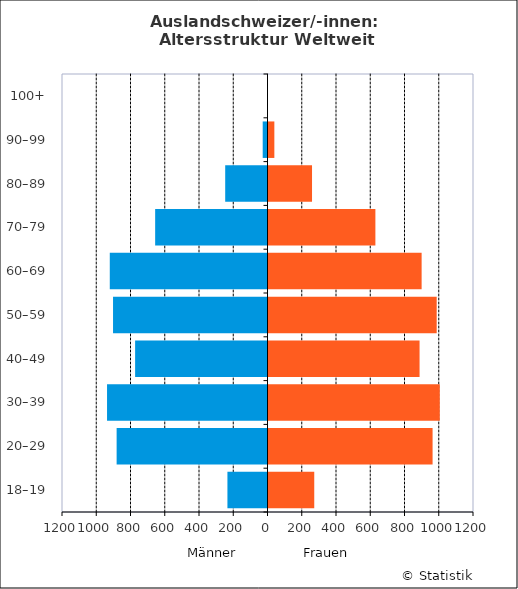
| Category | Männer | Frauen |
|---|---|---|
| 18–19 | -234 | 273 |
| 20–29 | -881 | 964 |
| 30–39 | -937 | 1006 |
| 40–49 | -773 | 888 |
| 50–59 | -902 | 988 |
| 60–69 | -921 | 900 |
| 70–79 | -656 | 630 |
| 80–89 | -247 | 260 |
| 90–99 | -28 | 40 |
| 100+ | -1 | 0 |